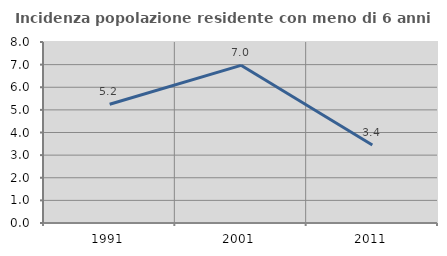
| Category | Incidenza popolazione residente con meno di 6 anni |
|---|---|
| 1991.0 | 5.247 |
| 2001.0 | 6.969 |
| 2011.0 | 3.448 |